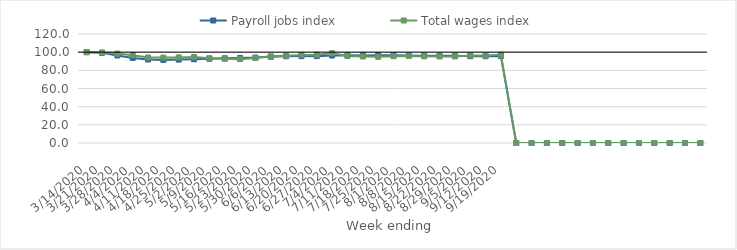
| Category | Payroll jobs index | Total wages index |
|---|---|---|
| 14/03/2020 | 100 | 100 |
| 21/03/2020 | 99.278 | 99.672 |
| 28/03/2020 | 96.309 | 98.416 |
| 04/04/2020 | 93.652 | 96.688 |
| 11/04/2020 | 91.928 | 94.131 |
| 18/04/2020 | 91.47 | 94.024 |
| 25/04/2020 | 91.802 | 94.259 |
| 02/05/2020 | 92.199 | 94.709 |
| 09/05/2020 | 92.746 | 93.35 |
| 16/05/2020 | 93.278 | 92.689 |
| 23/05/2020 | 93.582 | 92.309 |
| 30/05/2020 | 94.088 | 93.584 |
| 06/06/2020 | 95.005 | 95.392 |
| 13/06/2020 | 95.464 | 96.09 |
| 20/06/2020 | 95.655 | 97.004 |
| 27/06/2020 | 95.595 | 97.247 |
| 04/07/2020 | 96.297 | 98.874 |
| 11/07/2020 | 96.584 | 95.79 |
| 18/07/2020 | 96.449 | 95.216 |
| 25/07/2020 | 96.501 | 94.86 |
| 01/08/2020 | 96.569 | 95.541 |
| 08/08/2020 | 96.344 | 95.915 |
| 15/08/2020 | 96.168 | 95.478 |
| 22/08/2020 | 96.063 | 95.259 |
| 29/08/2020 | 95.951 | 95.312 |
| 05/09/2020 | 95.576 | 96.393 |
| 12/09/2020 | 95.53 | 96.207 |
| 19/09/2020 | 95.881 | 97.123 |